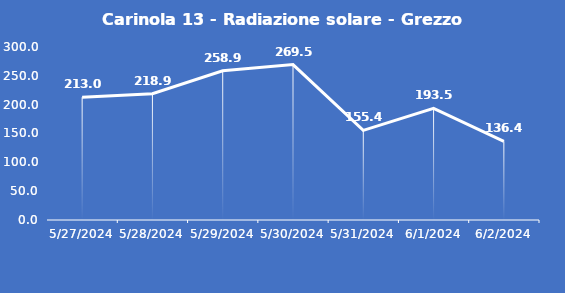
| Category | Carinola 13 - Radiazione solare - Grezzo (W/m2) |
|---|---|
| 5/27/24 | 213 |
| 5/28/24 | 218.9 |
| 5/29/24 | 258.9 |
| 5/30/24 | 269.5 |
| 5/31/24 | 155.4 |
| 6/1/24 | 193.5 |
| 6/2/24 | 136.4 |